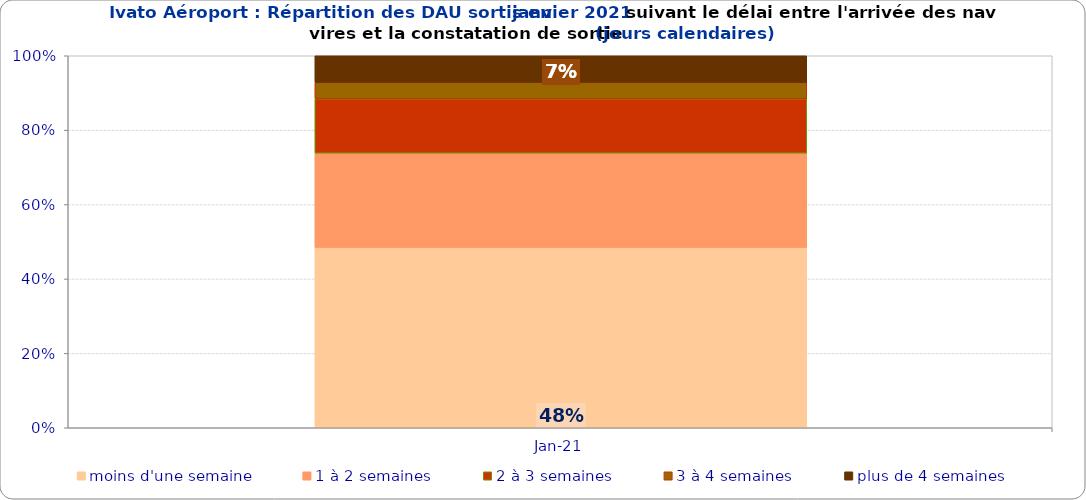
| Category | moins d'une semaine | 1 à 2 semaines | 2 à 3 semaines | 3 à 4 semaines | plus de 4 semaines |
|---|---|---|---|---|---|
| 2021-01-01 | 0.485 | 0.253 | 0.146 | 0.044 | 0.072 |